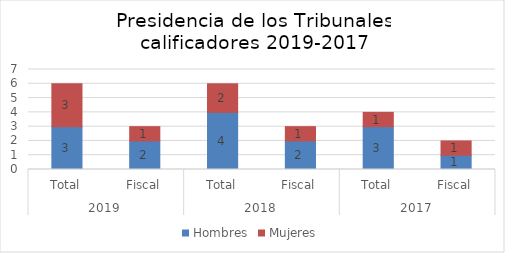
| Category | Hombres | Mujeres |
|---|---|---|
| 0 | 3 | 3 |
| 1 | 2 | 1 |
| 2 | 4 | 2 |
| 3 | 2 | 1 |
| 4 | 3 | 1 |
| 5 | 1 | 1 |